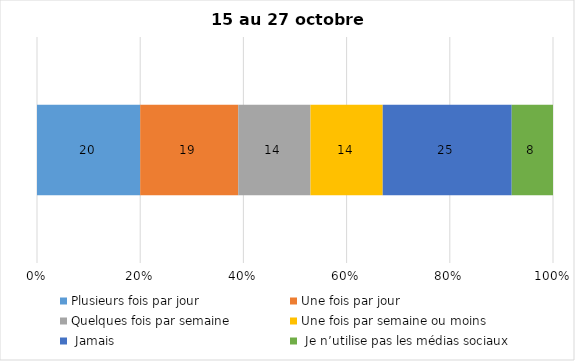
| Category | Plusieurs fois par jour | Une fois par jour | Quelques fois par semaine   | Une fois par semaine ou moins   |  Jamais   |  Je n’utilise pas les médias sociaux |
|---|---|---|---|---|---|---|
| 0 | 20 | 19 | 14 | 14 | 25 | 8 |